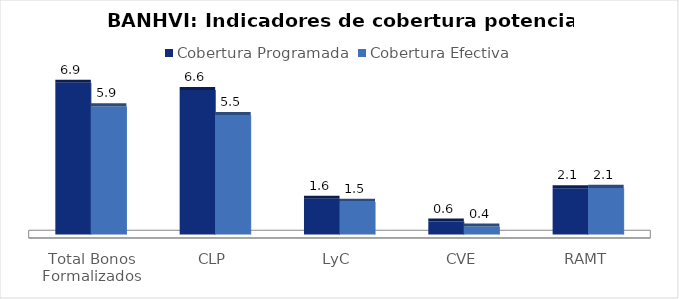
| Category | Cobertura Programada | Cobertura Efectiva |
|---|---|---|
| Total Bonos Formalizados | 6.934 | 5.854 |
| CLP | 6.601 | 5.456 |
| LyC | 1.63 | 1.494 |
| CVE | 0.591 | 0.364 |
| RAMT | 2.116 | 2.129 |